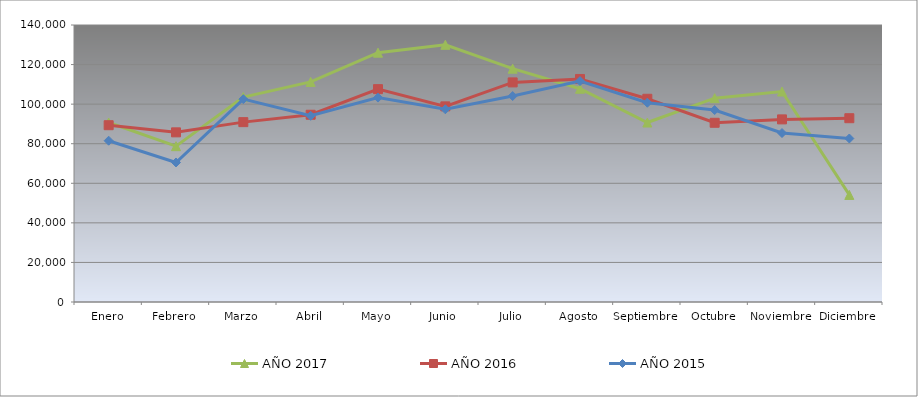
| Category | AÑO 2017 | AÑO 2016 | AÑO 2015 |
|---|---|---|---|
| Enero | 90736.735 | 89353.775 | 81514.937 |
| Febrero | 78759.457 | 85743.745 | 70519.899 |
| Marzo | 103579.744 | 90907.786 | 102520.709 |
| Abril | 111236.434 | 94643.318 | 94099.443 |
| Mayo | 126011.026 | 107584.795 | 103308.152 |
| Junio | 129984.148 | 98873.475 | 97402.329 |
| Julio | 117925.501 | 110988.115 | 104095.595 |
| Agosto | 107780.111 | 112730.379 | 111656.506 |
| Septiembre | 90711.078 | 102719.744 | 100705.215 |
| Octubre | 103029.957 | 90582.957 | 97008.608 |
| Noviembre | 106372.658 | 92295.691 | 85393.823 |
| Diciembre | 54113.635 | 92893.671 | 82637.772 |